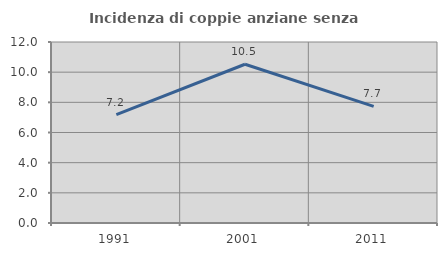
| Category | Incidenza di coppie anziane senza figli  |
|---|---|
| 1991.0 | 7.19 |
| 2001.0 | 10.526 |
| 2011.0 | 7.732 |